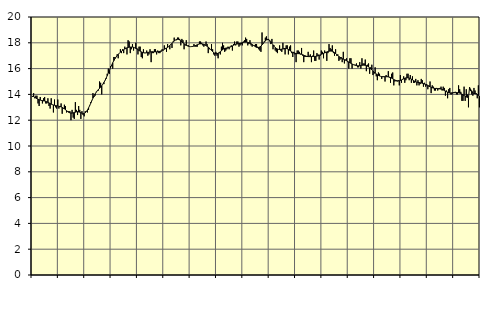
| Category | Piggar | Series 1 |
|---|---|---|
| nan | 13.8 | 13.86 |
| 87.0 | 14.1 | 13.83 |
| 87.0 | 13.7 | 13.78 |
| 87.0 | 13.9 | 13.72 |
| 87.0 | 13.9 | 13.67 |
| 87.0 | 13.3 | 13.63 |
| 87.0 | 13.1 | 13.59 |
| 87.0 | 13.8 | 13.56 |
| 87.0 | 13.5 | 13.53 |
| 87.0 | 13.3 | 13.52 |
| 87.0 | 13.7 | 13.5 |
| 87.0 | 13.8 | 13.49 |
| nan | 13.3 | 13.46 |
| 88.0 | 13.3 | 13.43 |
| 88.0 | 13.7 | 13.39 |
| 88.0 | 13.1 | 13.34 |
| 88.0 | 12.9 | 13.29 |
| 88.0 | 13.7 | 13.24 |
| 88.0 | 13.2 | 13.21 |
| 88.0 | 12.6 | 13.18 |
| 88.0 | 13.6 | 13.16 |
| 88.0 | 13 | 13.14 |
| 88.0 | 12.9 | 13.12 |
| 88.0 | 13.6 | 13.11 |
| nan | 12.9 | 13.08 |
| 89.0 | 13.1 | 13.06 |
| 89.0 | 13.3 | 13.03 |
| 89.0 | 12.5 | 12.99 |
| 89.0 | 12.9 | 12.94 |
| 89.0 | 13.2 | 12.88 |
| 89.0 | 13.1 | 12.81 |
| 89.0 | 12.6 | 12.74 |
| 89.0 | 12.7 | 12.67 |
| 89.0 | 12.7 | 12.61 |
| 89.0 | 12.7 | 12.57 |
| 89.0 | 12 | 12.56 |
| nan | 12.8 | 12.55 |
| 90.0 | 12.2 | 12.57 |
| 90.0 | 12.1 | 12.6 |
| 90.0 | 13.4 | 12.62 |
| 90.0 | 12.8 | 12.65 |
| 90.0 | 12.4 | 12.66 |
| 90.0 | 13.1 | 12.64 |
| 90.0 | 12.8 | 12.62 |
| 90.0 | 12.1 | 12.58 |
| 90.0 | 12.7 | 12.54 |
| 90.0 | 12.4 | 12.52 |
| 90.0 | 12.3 | 12.53 |
| nan | 12.7 | 12.58 |
| 91.0 | 12.7 | 12.67 |
| 91.0 | 12.6 | 12.79 |
| 91.0 | 12.8 | 12.95 |
| 91.0 | 13.1 | 13.13 |
| 91.0 | 13.4 | 13.32 |
| 91.0 | 13.5 | 13.52 |
| 91.0 | 14.1 | 13.71 |
| 91.0 | 13.8 | 13.89 |
| 91.0 | 13.9 | 14.04 |
| 91.0 | 14.2 | 14.17 |
| 91.0 | 14.3 | 14.28 |
| nan | 14.3 | 14.38 |
| 92.0 | 15 | 14.47 |
| 92.0 | 14.9 | 14.56 |
| 92.0 | 14 | 14.67 |
| 92.0 | 14.8 | 14.79 |
| 92.0 | 14.8 | 14.93 |
| 92.0 | 15.1 | 15.08 |
| 92.0 | 15.2 | 15.26 |
| 92.0 | 15.6 | 15.45 |
| 92.0 | 16 | 15.66 |
| 92.0 | 15.6 | 15.86 |
| 92.0 | 16.2 | 16.07 |
| nan | 16.2 | 16.26 |
| 93.0 | 16 | 16.45 |
| 93.0 | 16.9 | 16.61 |
| 93.0 | 16.9 | 16.76 |
| 93.0 | 16.9 | 16.89 |
| 93.0 | 17.1 | 17.01 |
| 93.0 | 16.8 | 17.11 |
| 93.0 | 17.2 | 17.2 |
| 93.0 | 17.5 | 17.27 |
| 93.0 | 17.2 | 17.34 |
| 93.0 | 17.5 | 17.41 |
| 93.0 | 17.2 | 17.46 |
| nan | 17.7 | 17.52 |
| 94.0 | 17.6 | 17.56 |
| 94.0 | 17.1 | 17.61 |
| 94.0 | 18.2 | 17.64 |
| 94.0 | 18.1 | 17.66 |
| 94.0 | 17.2 | 17.67 |
| 94.0 | 17.5 | 17.67 |
| 94.0 | 17.9 | 17.67 |
| 94.0 | 17.4 | 17.65 |
| 94.0 | 17.6 | 17.61 |
| 94.0 | 18 | 17.57 |
| 94.0 | 17.6 | 17.52 |
| nan | 17.1 | 17.46 |
| 95.0 | 17.7 | 17.41 |
| 95.0 | 17.7 | 17.35 |
| 95.0 | 16.9 | 17.3 |
| 95.0 | 16.8 | 17.26 |
| 95.0 | 17.5 | 17.23 |
| 95.0 | 17.2 | 17.22 |
| 95.0 | 17.2 | 17.22 |
| 95.0 | 17.4 | 17.23 |
| 95.0 | 17 | 17.25 |
| 95.0 | 17.1 | 17.27 |
| 95.0 | 17.5 | 17.29 |
| nan | 16.5 | 17.3 |
| 96.0 | 17.2 | 17.31 |
| 96.0 | 17.2 | 17.3 |
| 96.0 | 17.5 | 17.3 |
| 96.0 | 17.5 | 17.3 |
| 96.0 | 17.1 | 17.3 |
| 96.0 | 17.4 | 17.3 |
| 96.0 | 17.2 | 17.32 |
| 96.0 | 17.2 | 17.34 |
| 96.0 | 17.3 | 17.37 |
| 96.0 | 17.5 | 17.41 |
| 96.0 | 17.4 | 17.45 |
| nan | 17.8 | 17.5 |
| 97.0 | 17.6 | 17.54 |
| 97.0 | 17.3 | 17.59 |
| 97.0 | 17.9 | 17.65 |
| 97.0 | 17.7 | 17.71 |
| 97.0 | 17.5 | 17.79 |
| 97.0 | 17.9 | 17.87 |
| 97.0 | 17.6 | 17.96 |
| 97.0 | 18.1 | 18.05 |
| 97.0 | 18.4 | 18.14 |
| 97.0 | 18.2 | 18.21 |
| 97.0 | 18.2 | 18.26 |
| nan | 18.4 | 18.27 |
| 98.0 | 18.4 | 18.26 |
| 98.0 | 18.3 | 18.22 |
| 98.0 | 17.8 | 18.16 |
| 98.0 | 18.3 | 18.08 |
| 98.0 | 18.2 | 18 |
| 98.0 | 17.5 | 17.93 |
| 98.0 | 17.8 | 17.86 |
| 98.0 | 18.2 | 17.8 |
| 98.0 | 17.8 | 17.76 |
| 98.0 | 17.8 | 17.73 |
| 98.0 | 17.7 | 17.71 |
| nan | 17.7 | 17.7 |
| 99.0 | 17.7 | 17.71 |
| 99.0 | 17.7 | 17.72 |
| 99.0 | 17.9 | 17.75 |
| 99.0 | 17.7 | 17.77 |
| 99.0 | 17.7 | 17.81 |
| 99.0 | 17.7 | 17.85 |
| 99.0 | 17.9 | 17.88 |
| 99.0 | 18.1 | 17.91 |
| 99.0 | 18.1 | 17.92 |
| 99.0 | 18 | 17.92 |
| 99.0 | 17.8 | 17.9 |
| nan | 17.7 | 17.88 |
| 0.0 | 17.8 | 17.84 |
| 0.0 | 18.1 | 17.79 |
| 0.0 | 17.9 | 17.73 |
| 0.0 | 17.2 | 17.67 |
| 0.0 | 17.5 | 17.59 |
| 0.0 | 17.5 | 17.51 |
| 0.0 | 17.9 | 17.41 |
| 0.0 | 17.5 | 17.32 |
| 0.0 | 17.1 | 17.24 |
| 0.0 | 17 | 17.18 |
| 0.0 | 17.3 | 17.16 |
| nan | 17 | 17.16 |
| 1.0 | 16.8 | 17.19 |
| 1.0 | 17.2 | 17.24 |
| 1.0 | 17.1 | 17.31 |
| 1.0 | 17.7 | 17.38 |
| 1.0 | 18 | 17.46 |
| 1.0 | 17.8 | 17.52 |
| 1.0 | 17.3 | 17.56 |
| 1.0 | 17.4 | 17.59 |
| 1.0 | 17.5 | 17.6 |
| 1.0 | 17.7 | 17.62 |
| 1.0 | 17.5 | 17.64 |
| nan | 17.7 | 17.67 |
| 2.0 | 17.8 | 17.71 |
| 2.0 | 17.4 | 17.76 |
| 2.0 | 17.9 | 17.81 |
| 2.0 | 18.1 | 17.85 |
| 2.0 | 17.8 | 17.88 |
| 2.0 | 18.1 | 17.9 |
| 2.0 | 18.1 | 17.92 |
| 2.0 | 17.7 | 17.94 |
| 2.0 | 17.8 | 17.96 |
| 2.0 | 17.9 | 17.98 |
| 2.0 | 17.8 | 18.01 |
| nan | 18.1 | 18.03 |
| 3.0 | 18.2 | 18.05 |
| 3.0 | 18.4 | 18.05 |
| 3.0 | 18.3 | 18.05 |
| 3.0 | 17.8 | 18.03 |
| 3.0 | 17.9 | 18.01 |
| 3.0 | 18.2 | 17.97 |
| 3.0 | 17.8 | 17.93 |
| 3.0 | 17.7 | 17.87 |
| 3.0 | 17.8 | 17.81 |
| 3.0 | 17.8 | 17.75 |
| 3.0 | 17.9 | 17.69 |
| nan | 17.9 | 17.65 |
| 4.0 | 17.7 | 17.63 |
| 4.0 | 17.5 | 17.64 |
| 4.0 | 17.4 | 17.68 |
| 4.0 | 17.3 | 17.74 |
| 4.0 | 18.8 | 17.84 |
| 4.0 | 18 | 17.94 |
| 4.0 | 18.1 | 18.05 |
| 4.0 | 18.4 | 18.15 |
| 4.0 | 18.5 | 18.22 |
| 4.0 | 18.3 | 18.25 |
| 4.0 | 18.3 | 18.24 |
| nan | 18.1 | 18.18 |
| 5.0 | 17.9 | 18.08 |
| 5.0 | 18.3 | 17.96 |
| 5.0 | 17.5 | 17.84 |
| 5.0 | 17.8 | 17.72 |
| 5.0 | 17.4 | 17.63 |
| 5.0 | 17.3 | 17.56 |
| 5.0 | 17.2 | 17.52 |
| 5.0 | 17.5 | 17.49 |
| 5.0 | 17.8 | 17.48 |
| 5.0 | 17.4 | 17.49 |
| 5.0 | 17.3 | 17.51 |
| nan | 18 | 17.53 |
| 6.0 | 17.5 | 17.55 |
| 6.0 | 17.1 | 17.56 |
| 6.0 | 17.8 | 17.56 |
| 6.0 | 17.8 | 17.53 |
| 6.0 | 17.1 | 17.49 |
| 6.0 | 17.7 | 17.43 |
| 6.0 | 17.8 | 17.36 |
| 6.0 | 17.2 | 17.3 |
| 6.0 | 16.9 | 17.25 |
| 6.0 | 17.3 | 17.21 |
| 6.0 | 17.1 | 17.19 |
| nan | 16.5 | 17.17 |
| 7.0 | 17.4 | 17.16 |
| 7.0 | 17.4 | 17.16 |
| 7.0 | 17.3 | 17.15 |
| 7.0 | 17.1 | 17.14 |
| 7.0 | 17.6 | 17.11 |
| 7.0 | 17 | 17.08 |
| 7.0 | 16.5 | 17.04 |
| 7.0 | 16.9 | 17 |
| 7.0 | 16.9 | 16.97 |
| 7.0 | 16.9 | 16.94 |
| 7.0 | 17.3 | 16.93 |
| nan | 17 | 16.93 |
| 8.0 | 17.1 | 16.93 |
| 8.0 | 16.5 | 16.93 |
| 8.0 | 17 | 16.94 |
| 8.0 | 17.4 | 16.94 |
| 8.0 | 16.6 | 16.94 |
| 8.0 | 16.6 | 16.95 |
| 8.0 | 17.2 | 16.97 |
| 8.0 | 17.1 | 17 |
| 8.0 | 16.7 | 17.03 |
| 8.0 | 17 | 17.07 |
| 8.0 | 17.4 | 17.11 |
| nan | 17.3 | 17.14 |
| 9.0 | 16.8 | 17.18 |
| 9.0 | 17.4 | 17.22 |
| 9.0 | 17.3 | 17.25 |
| 9.0 | 16.6 | 17.29 |
| 9.0 | 17.2 | 17.32 |
| 9.0 | 17.9 | 17.35 |
| 9.0 | 17.6 | 17.36 |
| 9.0 | 17.5 | 17.36 |
| 9.0 | 17.8 | 17.34 |
| 9.0 | 17.2 | 17.3 |
| 9.0 | 17 | 17.24 |
| nan | 17.5 | 17.17 |
| 10.0 | 17 | 17.09 |
| 10.0 | 17.1 | 17.01 |
| 10.0 | 16.6 | 16.94 |
| 10.0 | 16.7 | 16.87 |
| 10.0 | 16.9 | 16.81 |
| 10.0 | 16.5 | 16.77 |
| 10.0 | 17.3 | 16.73 |
| 10.0 | 16.4 | 16.69 |
| 10.0 | 16.7 | 16.65 |
| 10.0 | 16.8 | 16.61 |
| 10.0 | 16.5 | 16.56 |
| nan | 16 | 16.51 |
| 11.0 | 16.8 | 16.46 |
| 11.0 | 16.8 | 16.41 |
| 11.0 | 16 | 16.36 |
| 11.0 | 16.3 | 16.31 |
| 11.0 | 16.3 | 16.28 |
| 11.0 | 16.3 | 16.25 |
| 11.0 | 16.4 | 16.23 |
| 11.0 | 16.1 | 16.22 |
| 11.0 | 16.1 | 16.22 |
| 11.0 | 16.5 | 16.23 |
| 11.0 | 16 | 16.24 |
| nan | 16.8 | 16.26 |
| 12.0 | 16.4 | 16.27 |
| 12.0 | 16.4 | 16.27 |
| 12.0 | 16.7 | 16.25 |
| 12.0 | 15.8 | 16.23 |
| 12.0 | 16.3 | 16.19 |
| 12.0 | 16.4 | 16.13 |
| 12.0 | 15.6 | 16.06 |
| 12.0 | 16.1 | 15.98 |
| 12.0 | 16.3 | 15.89 |
| 12.0 | 15.5 | 15.81 |
| 12.0 | 15.6 | 15.73 |
| nan | 16.1 | 15.66 |
| 13.0 | 15.4 | 15.59 |
| 13.0 | 15.1 | 15.53 |
| 13.0 | 15.7 | 15.47 |
| 13.0 | 15.6 | 15.43 |
| 13.0 | 15.4 | 15.4 |
| 13.0 | 15.2 | 15.38 |
| 13.0 | 15.4 | 15.37 |
| 13.0 | 15.4 | 15.37 |
| 13.0 | 15 | 15.37 |
| 13.0 | 15.5 | 15.37 |
| 13.0 | 15.4 | 15.37 |
| nan | 15.8 | 15.36 |
| 14.0 | 15.3 | 15.34 |
| 14.0 | 14.9 | 15.31 |
| 14.0 | 15.6 | 15.26 |
| 14.0 | 15.7 | 15.21 |
| 14.0 | 14.7 | 15.16 |
| 14.0 | 15 | 15.11 |
| 14.0 | 15.1 | 15.08 |
| 14.0 | 15 | 15.05 |
| 14.0 | 15.1 | 15.04 |
| 14.0 | 14.7 | 15.06 |
| 14.0 | 15.5 | 15.08 |
| nan | 14.9 | 15.12 |
| 15.0 | 15.2 | 15.16 |
| 15.0 | 15.4 | 15.21 |
| 15.0 | 14.9 | 15.25 |
| 15.0 | 15.1 | 15.28 |
| 15.0 | 15.6 | 15.29 |
| 15.0 | 15.6 | 15.29 |
| 15.0 | 15.1 | 15.27 |
| 15.0 | 15.5 | 15.24 |
| 15.0 | 14.9 | 15.19 |
| 15.0 | 15.4 | 15.13 |
| 15.0 | 14.9 | 15.07 |
| nan | 14.9 | 15.02 |
| 16.0 | 15.2 | 14.98 |
| 16.0 | 14.7 | 14.95 |
| 16.0 | 15.1 | 14.93 |
| 16.0 | 14.7 | 14.92 |
| 16.0 | 14.8 | 14.9 |
| 16.0 | 15.2 | 14.89 |
| 16.0 | 15.1 | 14.86 |
| 16.0 | 14.6 | 14.84 |
| 16.0 | 14.9 | 14.8 |
| 16.0 | 14.6 | 14.77 |
| 16.0 | 14.8 | 14.72 |
| nan | 14.4 | 14.68 |
| 17.0 | 14.7 | 14.63 |
| 17.0 | 15 | 14.59 |
| 17.0 | 14.1 | 14.55 |
| 17.0 | 14.7 | 14.52 |
| 17.0 | 14.6 | 14.49 |
| 17.0 | 14.3 | 14.47 |
| 17.0 | 14.3 | 14.46 |
| 17.0 | 14.5 | 14.46 |
| 17.0 | 14.3 | 14.45 |
| 17.0 | 14.4 | 14.45 |
| 17.0 | 14.5 | 14.43 |
| nan | 14.6 | 14.41 |
| 18.0 | 14.3 | 14.39 |
| 18.0 | 14.6 | 14.35 |
| 18.0 | 14.5 | 14.3 |
| 18.0 | 13.9 | 14.26 |
| 18.0 | 14.3 | 14.21 |
| 18.0 | 13.7 | 14.17 |
| 18.0 | 14.4 | 14.13 |
| 18.0 | 14.5 | 14.11 |
| 18.0 | 14 | 14.11 |
| 18.0 | 14 | 14.12 |
| 18.0 | 14.1 | 14.13 |
| nan | 14.1 | 14.15 |
| 19.0 | 14.2 | 14.15 |
| 19.0 | 14 | 14.15 |
| 19.0 | 14 | 14.14 |
| 19.0 | 14.7 | 14.12 |
| 19.0 | 14.4 | 14.1 |
| 19.0 | 14.2 | 14.07 |
| 19.0 | 13.5 | 14.03 |
| 19.0 | 13.5 | 13.97 |
| 19.0 | 14.6 | 13.91 |
| 19.0 | 13.5 | 13.85 |
| 19.0 | 14.4 | 13.8 |
| nan | 14 | 13.77 |
| 20.0 | 13 | 13.76 |
| 20.0 | 14.5 | 14.54 |
| 20.0 | 14.4 | 14.27 |
| 20.0 | 14 | 14.28 |
| 20.0 | 13.9 | 14.08 |
| 20.0 | 14.5 | 14.08 |
| 20.0 | 14.3 | 14.06 |
| 20.0 | 14.1 | 14.04 |
| 20.0 | 13.7 | 14 |
| 20.0 | 14.7 | 13.93 |
| 20.0 | 13 | 13.86 |